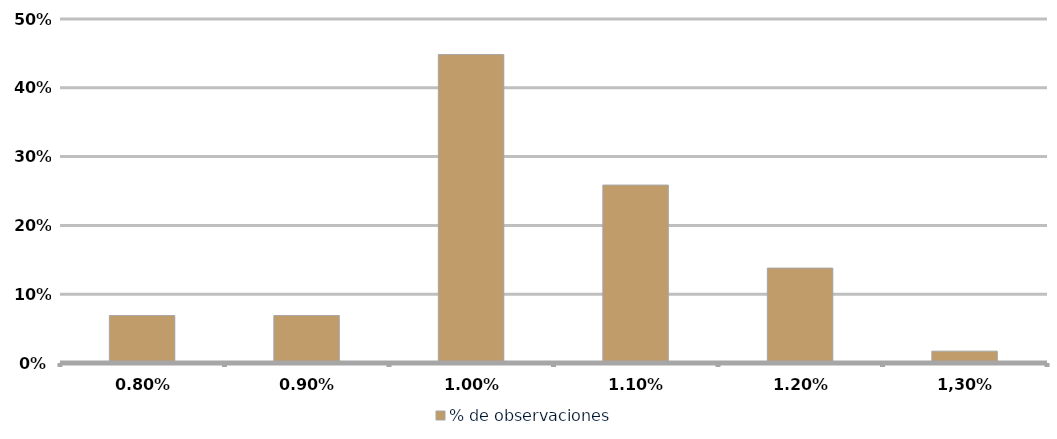
| Category | % de observaciones  |
|---|---|
| 0,80% | 0.069 |
| 0,90% | 0.069 |
| 1,00% | 0.448 |
| 1,10% | 0.259 |
| 1,20% | 0.138 |
| 1,30% | 0.017 |